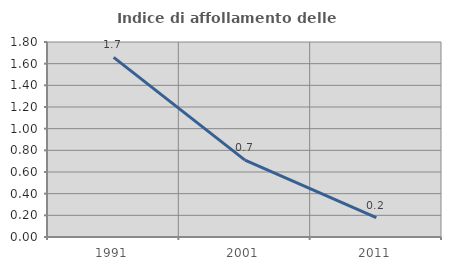
| Category | Indice di affollamento delle abitazioni  |
|---|---|
| 1991.0 | 1.657 |
| 2001.0 | 0.709 |
| 2011.0 | 0.18 |